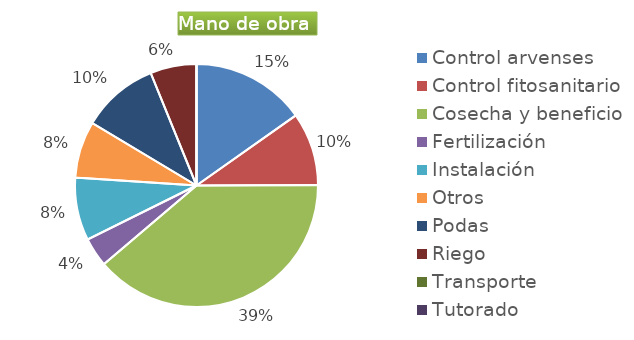
| Category | Series 0 |
|---|---|
| Control arvenses | 7645584 |
| Control fitosanitario | 4880160 |
| Cosecha y beneficio | 19520640 |
| Fertilización | 1952064 |
| Instalación | 4204067 |
| Otros | 3795680 |
| Podas | 5151280 |
| Riego | 3090768 |
| Transporte | 0 |
| Tutorado | 0 |